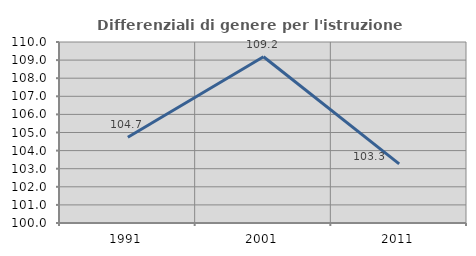
| Category | Differenziali di genere per l'istruzione superiore |
|---|---|
| 1991.0 | 104.742 |
| 2001.0 | 109.183 |
| 2011.0 | 103.263 |